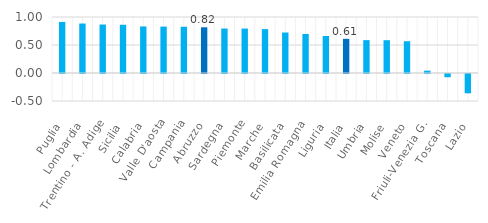
| Category | Series 0 |
|---|---|
| Puglia | 0.912 |
| Lombardia | 0.884 |
| Trentino - A. Adige | 0.865 |
| Sicilia | 0.861 |
| Calabria | 0.831 |
| Valle D'aosta | 0.828 |
| Campania | 0.826 |
| Abruzzo | 0.816 |
| Sardegna | 0.794 |
| Piemonte | 0.794 |
| Marche | 0.784 |
| Basilicata | 0.723 |
| Emilia Romagna | 0.697 |
| Liguria | 0.661 |
| Italia | 0.61 |
| Umbria | 0.587 |
| Molise | 0.586 |
| Veneto | 0.568 |
| Friuli-Venezia G. | 0.042 |
| Toscana | -0.058 |
| Lazio | -0.345 |